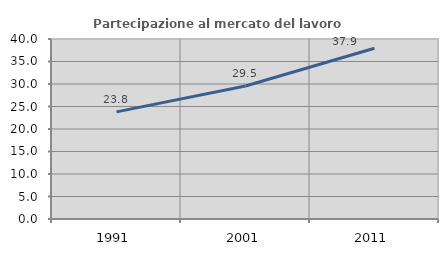
| Category | Partecipazione al mercato del lavoro  femminile |
|---|---|
| 1991.0 | 23.81 |
| 2001.0 | 29.545 |
| 2011.0 | 37.931 |